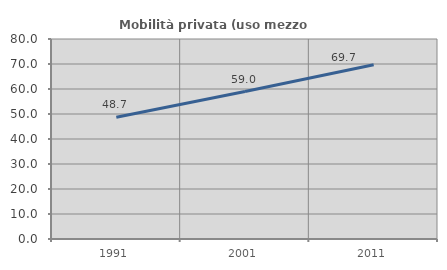
| Category | Mobilità privata (uso mezzo privato) |
|---|---|
| 1991.0 | 48.687 |
| 2001.0 | 58.984 |
| 2011.0 | 69.721 |